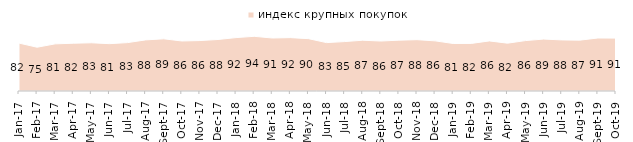
| Category | индекс крупных покупок |
|---|---|
| 2017-01-01 | 82.1 |
| 2017-02-01 | 75.05 |
| 2017-03-01 | 80.8 |
| 2017-04-01 | 81.9 |
| 2017-05-01 | 82.65 |
| 2017-06-01 | 81.15 |
| 2017-07-01 | 82.95 |
| 2017-08-01 | 87.6 |
| 2017-09-01 | 89.45 |
| 2017-10-01 | 85.75 |
| 2017-11-01 | 86.45 |
| 2017-12-01 | 88.3 |
| 2018-01-01 | 91.55 |
| 2018-02-01 | 93.75 |
| 2018-03-01 | 90.85 |
| 2018-04-01 | 91.5 |
| 2018-05-01 | 89.75 |
| 2018-06-01 | 82.95 |
| 2018-07-01 | 84.7 |
| 2018-08-01 | 87.05 |
| 2018-09-01 | 85.65 |
| 2018-10-01 | 87.15 |
| 2018-11-01 | 87.974 |
| 2018-12-01 | 85.95 |
| 2019-01-01 | 81.45 |
| 2019-02-01 | 81.55 |
| 2019-03-01 | 85.828 |
| 2019-04-01 | 81.98 |
| 2019-05-01 | 86.429 |
| 2019-06-01 | 89.027 |
| 2019-07-01 | 87.574 |
| 2019-08-01 | 87.213 |
| 2019-09-01 | 90.842 |
| 2019-10-01 | 90.644 |